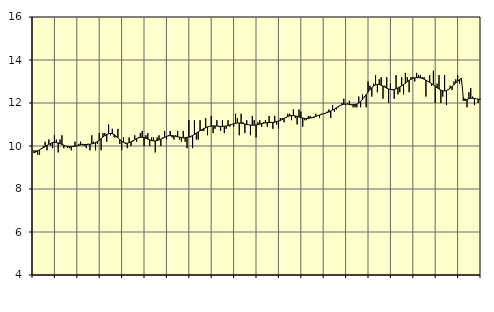
| Category | Utbildning, SNI 85 | Series 1 |
|---|---|---|
| nan | 9.8 | 9.68 |
| 1.0 | 9.8 | 9.72 |
| 1.0 | 9.6 | 9.78 |
| 1.0 | 9.6 | 9.82 |
| 1.0 | 9.9 | 9.87 |
| 1.0 | 10 | 9.92 |
| 1.0 | 10.2 | 9.97 |
| 1.0 | 9.8 | 10.03 |
| 1.0 | 10.3 | 10.08 |
| 1.0 | 10 | 10.12 |
| 1.0 | 9.9 | 10.16 |
| 1.0 | 10.5 | 10.17 |
| nan | 10.3 | 10.16 |
| 2.0 | 9.7 | 10.14 |
| 2.0 | 10.3 | 10.11 |
| 2.0 | 10.5 | 10.07 |
| 2.0 | 9.9 | 10.04 |
| 2.0 | 10 | 10 |
| 2.0 | 9.9 | 9.98 |
| 2.0 | 9.9 | 9.97 |
| 2.0 | 9.8 | 9.97 |
| 2.0 | 10 | 9.98 |
| 2.0 | 10.2 | 9.99 |
| 2.0 | 10 | 10.01 |
| nan | 10.1 | 10.03 |
| 3.0 | 10.2 | 10.05 |
| 3.0 | 10.1 | 10.06 |
| 3.0 | 10 | 10.07 |
| 3.0 | 9.9 | 10.07 |
| 3.0 | 10.1 | 10.08 |
| 3.0 | 9.8 | 10.08 |
| 3.0 | 10.5 | 10.1 |
| 3.0 | 10.2 | 10.12 |
| 3.0 | 9.8 | 10.16 |
| 3.0 | 10.1 | 10.21 |
| 3.0 | 10.6 | 10.27 |
| nan | 9.8 | 10.34 |
| 4.0 | 10.6 | 10.42 |
| 4.0 | 10.6 | 10.48 |
| 4.0 | 10.2 | 10.54 |
| 4.0 | 11 | 10.57 |
| 4.0 | 10.5 | 10.59 |
| 4.0 | 10.8 | 10.57 |
| 4.0 | 10.4 | 10.53 |
| 4.0 | 10.4 | 10.46 |
| 4.0 | 10.8 | 10.39 |
| 4.0 | 10.1 | 10.3 |
| 4.0 | 9.8 | 10.23 |
| nan | 10.4 | 10.17 |
| 5.0 | 10.1 | 10.14 |
| 5.0 | 9.9 | 10.13 |
| 5.0 | 10.4 | 10.15 |
| 5.0 | 10 | 10.19 |
| 5.0 | 10.2 | 10.24 |
| 5.0 | 10.5 | 10.29 |
| 5.0 | 10.2 | 10.34 |
| 5.0 | 10.4 | 10.38 |
| 5.0 | 10.6 | 10.4 |
| 5.0 | 10.7 | 10.4 |
| 5.0 | 10 | 10.39 |
| nan | 10.5 | 10.36 |
| 6.0 | 10.6 | 10.32 |
| 6.0 | 10 | 10.29 |
| 6.0 | 10.4 | 10.25 |
| 6.0 | 10.4 | 10.24 |
| 6.0 | 9.7 | 10.24 |
| 6.0 | 10.4 | 10.25 |
| 6.0 | 10.5 | 10.28 |
| 6.0 | 10 | 10.32 |
| 6.0 | 10.4 | 10.36 |
| 6.0 | 10.7 | 10.4 |
| 6.0 | 10.3 | 10.44 |
| nan | 10.5 | 10.47 |
| 7.0 | 10.7 | 10.48 |
| 7.0 | 10.4 | 10.48 |
| 7.0 | 10.3 | 10.47 |
| 7.0 | 10.5 | 10.45 |
| 7.0 | 10.7 | 10.43 |
| 7.0 | 10.3 | 10.41 |
| 7.0 | 10.2 | 10.39 |
| 7.0 | 10.7 | 10.38 |
| 7.0 | 10.2 | 10.38 |
| 7.0 | 9.9 | 10.4 |
| 7.0 | 11.2 | 10.42 |
| nan | 10.4 | 10.45 |
| 8.0 | 9.9 | 10.49 |
| 8.0 | 11.2 | 10.54 |
| 8.0 | 10.3 | 10.6 |
| 8.0 | 10.3 | 10.66 |
| 8.0 | 11.2 | 10.71 |
| 8.0 | 10.7 | 10.76 |
| 8.0 | 10.7 | 10.81 |
| 8.0 | 11.3 | 10.85 |
| 8.0 | 10.5 | 10.89 |
| 8.0 | 10.9 | 10.91 |
| 8.0 | 11.4 | 10.93 |
| nan | 10.6 | 10.94 |
| 9.0 | 10.8 | 10.93 |
| 9.0 | 11.2 | 10.93 |
| 9.0 | 10.9 | 10.92 |
| 9.0 | 10.7 | 10.91 |
| 9.0 | 11.2 | 10.91 |
| 9.0 | 10.6 | 10.92 |
| 9.0 | 10.8 | 10.93 |
| 9.0 | 11.2 | 10.95 |
| 9.0 | 10.9 | 10.98 |
| 9.0 | 11 | 11.01 |
| 9.0 | 10.9 | 11.04 |
| nan | 11.5 | 11.06 |
| 10.0 | 11.3 | 11.07 |
| 10.0 | 10.5 | 11.07 |
| 10.0 | 11.5 | 11.06 |
| 10.0 | 11.1 | 11.05 |
| 10.0 | 10.6 | 11.02 |
| 10.0 | 11.2 | 11 |
| 10.0 | 11 | 10.99 |
| 10.0 | 10.5 | 10.97 |
| 10.0 | 11.4 | 10.97 |
| 10.0 | 11.2 | 10.97 |
| 10.0 | 10.4 | 10.98 |
| nan | 11.1 | 11 |
| 11.0 | 11.2 | 11.02 |
| 11.0 | 10.9 | 11.04 |
| 11.0 | 11.1 | 11.06 |
| 11.0 | 11.2 | 11.08 |
| 11.0 | 10.9 | 11.09 |
| 11.0 | 11.4 | 11.09 |
| 11.0 | 11.1 | 11.1 |
| 11.0 | 10.8 | 11.1 |
| 11.0 | 11.4 | 11.11 |
| 11.0 | 11 | 11.13 |
| 11.0 | 10.8 | 11.16 |
| nan | 11.3 | 11.19 |
| 12.0 | 11.3 | 11.23 |
| 12.0 | 11.1 | 11.28 |
| 12.0 | 11.3 | 11.33 |
| 12.0 | 11.5 | 11.37 |
| 12.0 | 11.5 | 11.4 |
| 12.0 | 11.2 | 11.42 |
| 12.0 | 11.7 | 11.42 |
| 12.0 | 11.3 | 11.4 |
| 12.0 | 11 | 11.38 |
| 12.0 | 11.7 | 11.35 |
| 12.0 | 11.6 | 11.32 |
| nan | 10.9 | 11.3 |
| 13.0 | 11.2 | 11.28 |
| 13.0 | 11.2 | 11.28 |
| 13.0 | 11.4 | 11.28 |
| 13.0 | 11.4 | 11.3 |
| 13.0 | 11.3 | 11.32 |
| 13.0 | 11.3 | 11.35 |
| 13.0 | 11.5 | 11.38 |
| 13.0 | 11.4 | 11.41 |
| 13.0 | 11.3 | 11.44 |
| 13.0 | 11.5 | 11.47 |
| 13.0 | 11.5 | 11.49 |
| nan | 11.5 | 11.52 |
| 14.0 | 11.6 | 11.55 |
| 14.0 | 11.7 | 11.58 |
| 14.0 | 11.3 | 11.62 |
| 14.0 | 11.9 | 11.67 |
| 14.0 | 11.6 | 11.72 |
| 14.0 | 11.7 | 11.78 |
| 14.0 | 11.8 | 11.83 |
| 14.0 | 11.9 | 11.88 |
| 14.0 | 12 | 11.92 |
| 14.0 | 12.2 | 11.94 |
| 14.0 | 11.9 | 11.95 |
| nan | 12 | 11.95 |
| 15.0 | 12.1 | 11.93 |
| 15.0 | 11.9 | 11.92 |
| 15.0 | 11.8 | 11.92 |
| 15.0 | 11.8 | 11.93 |
| 15.0 | 11.8 | 11.95 |
| 15.0 | 12.3 | 12 |
| 15.0 | 11.8 | 12.07 |
| 15.0 | 12.4 | 12.17 |
| 15.0 | 12.3 | 12.28 |
| 15.0 | 11.8 | 12.39 |
| 15.0 | 13 | 12.51 |
| nan | 12.8 | 12.62 |
| 16.0 | 12.3 | 12.72 |
| 16.0 | 12.9 | 12.79 |
| 16.0 | 13.3 | 12.84 |
| 16.0 | 12.5 | 12.86 |
| 16.0 | 13.1 | 12.86 |
| 16.0 | 13.2 | 12.83 |
| 16.0 | 12.2 | 12.79 |
| 16.0 | 12.8 | 12.74 |
| 16.0 | 13.2 | 12.69 |
| 16.0 | 12 | 12.65 |
| 16.0 | 12.9 | 12.63 |
| nan | 12.6 | 12.62 |
| 17.0 | 12.2 | 12.63 |
| 17.0 | 13.3 | 12.66 |
| 17.0 | 12.4 | 12.7 |
| 17.0 | 12.5 | 12.75 |
| 17.0 | 13.2 | 12.8 |
| 17.0 | 12.4 | 12.86 |
| 17.0 | 13.4 | 12.92 |
| 17.0 | 13.2 | 12.99 |
| 17.0 | 12.5 | 13.05 |
| 17.0 | 13.2 | 13.1 |
| 17.0 | 13.2 | 13.15 |
| nan | 13 | 13.17 |
| 18.0 | 13.4 | 13.19 |
| 18.0 | 13.3 | 13.18 |
| 18.0 | 13.3 | 13.17 |
| 18.0 | 13.2 | 13.14 |
| 18.0 | 13.2 | 13.11 |
| 18.0 | 12.3 | 13.06 |
| 18.0 | 13 | 13.01 |
| 18.0 | 13.3 | 12.96 |
| 18.0 | 12.8 | 12.9 |
| 18.0 | 13.5 | 12.84 |
| 18.0 | 12 | 12.78 |
| nan | 12.9 | 12.71 |
| 19.0 | 13.3 | 12.65 |
| 19.0 | 12 | 12.6 |
| 19.0 | 12.3 | 12.57 |
| 19.0 | 13.3 | 12.56 |
| 19.0 | 11.9 | 12.58 |
| 19.0 | 12.6 | 12.63 |
| 19.0 | 12.8 | 12.69 |
| 19.0 | 12.6 | 12.77 |
| 19.0 | 13 | 12.85 |
| 19.0 | 13.1 | 12.93 |
| 19.0 | 13.3 | 13.01 |
| nan | 12.9 | 13.09 |
| 20.0 | 13 | 13.15 |
| 20.0 | 12.1 | 12.25 |
| 20.0 | 12.2 | 12.1 |
| 20.0 | 11.8 | 12.17 |
| 20.0 | 12.5 | 12.2 |
| 20.0 | 12.7 | 12.22 |
| 20.0 | 12.3 | 12.22 |
| 20.0 | 11.9 | 12.21 |
| 20.0 | 12.2 | 12.2 |
| 20.0 | 12 | 12.18 |
| 20.0 | 12.2 | 12.16 |